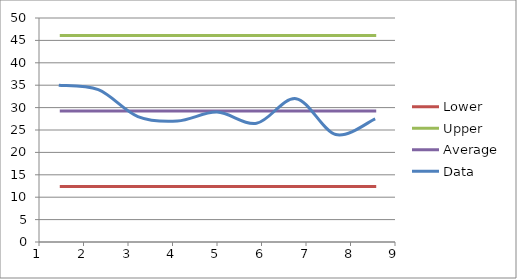
| Category | Lower | Upper | Average |
|---|---|---|---|
| 1.0 | 12.376 | 46.069 | 29.222 |
| 2.0 | 12.376 | 46.069 | 29.222 |
| 3.0 | 12.376 | 46.069 | 29.222 |
| 4.0 | 12.376 | 46.069 | 29.222 |
| 5.0 | 12.376 | 46.069 | 29.222 |
| 6.0 | 12.376 | 46.069 | 29.222 |
| 7.0 | 12.376 | 46.069 | 29.222 |
| 8.0 | 12.376 | 46.069 | 29.222 |
| 9.0 | 12.376 | 46.069 | 29.222 |